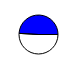
| Category | Series 0 |
|---|---|
| 0 | 10004718 |
| 1 | 9640806 |